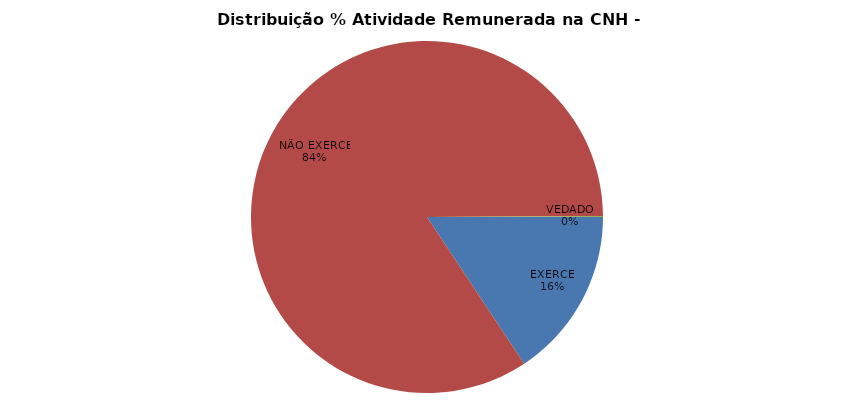
| Category | 2024/Maio |
|---|---|
| EXERCE | 860768 |
| NÃO EXERCE | 4620382 |
| VEDADO | 4626 |